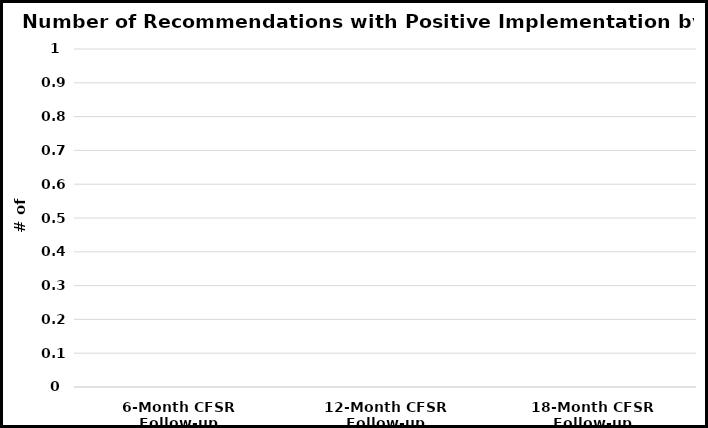
| Category | Series 1 |
|---|---|
| 6-Month CFSR Follow-up | 0 |
| 12-Month CFSR Follow-up | 0 |
| 18-Month CFSR Follow-up | 0 |